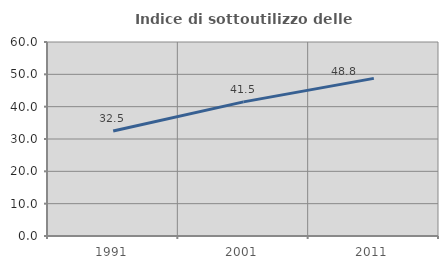
| Category | Indice di sottoutilizzo delle abitazioni  |
|---|---|
| 1991.0 | 32.5 |
| 2001.0 | 41.485 |
| 2011.0 | 48.756 |